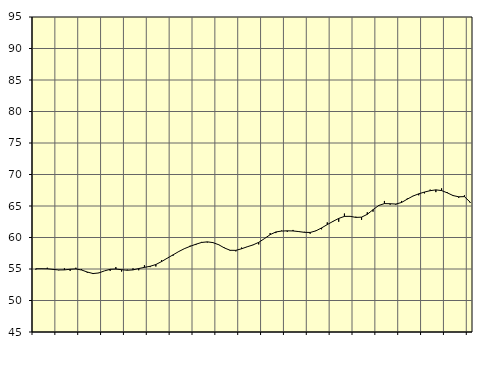
| Category | Piggar | Samtliga sysselsatta (inkl. sysselsatta utomlands) |
|---|---|---|
| nan | 54.9 | 55.04 |
| 1.0 | 55 | 55.04 |
| 1.0 | 55.2 | 55.03 |
| 1.0 | 54.9 | 54.94 |
| nan | 54.8 | 54.85 |
| 2.0 | 55.1 | 54.86 |
| 2.0 | 54.7 | 54.96 |
| 2.0 | 55.2 | 55.01 |
| nan | 55 | 54.84 |
| 3.0 | 54.4 | 54.52 |
| 3.0 | 54.2 | 54.28 |
| 3.0 | 54.4 | 54.37 |
| nan | 54.7 | 54.7 |
| 4.0 | 54.7 | 54.95 |
| 4.0 | 55.3 | 54.99 |
| 4.0 | 54.6 | 54.89 |
| nan | 54.9 | 54.8 |
| 5.0 | 55.1 | 54.86 |
| 5.0 | 54.8 | 55.07 |
| 5.0 | 55.6 | 55.26 |
| nan | 55.3 | 55.43 |
| 6.0 | 55.4 | 55.71 |
| 6.0 | 56.4 | 56.18 |
| 6.0 | 56.7 | 56.72 |
| nan | 57.1 | 57.24 |
| 7.0 | 57.8 | 57.77 |
| 7.0 | 58.2 | 58.23 |
| 7.0 | 58.7 | 58.6 |
| nan | 58.8 | 58.93 |
| 8.0 | 59.3 | 59.21 |
| 8.0 | 59.2 | 59.31 |
| 8.0 | 59.2 | 59.19 |
| nan | 58.9 | 58.85 |
| 9.0 | 58.4 | 58.34 |
| 9.0 | 57.9 | 57.97 |
| 9.0 | 57.8 | 57.96 |
| nan | 58.4 | 58.21 |
| 10.0 | 58.5 | 58.53 |
| 10.0 | 58.8 | 58.82 |
| 10.0 | 58.9 | 59.23 |
| nan | 59.8 | 59.82 |
| 11.0 | 60.7 | 60.45 |
| 11.0 | 60.7 | 60.88 |
| 11.0 | 61.1 | 61.02 |
| nan | 60.9 | 61.06 |
| 12.0 | 61.2 | 61.04 |
| 12.0 | 61 | 60.94 |
| 12.0 | 60.9 | 60.82 |
| nan | 60.6 | 60.8 |
| 13.0 | 61.1 | 61.05 |
| 13.0 | 61.3 | 61.52 |
| 13.0 | 62.4 | 62.05 |
| nan | 62.6 | 62.56 |
| 14.0 | 62.5 | 63.03 |
| 14.0 | 63.8 | 63.35 |
| 14.0 | 63.4 | 63.36 |
| nan | 63.3 | 63.19 |
| 15.0 | 62.8 | 63.23 |
| 15.0 | 64 | 63.68 |
| 15.0 | 64.1 | 64.41 |
| nan | 65 | 65.08 |
| 16.0 | 65.8 | 65.38 |
| 16.0 | 65.2 | 65.36 |
| 16.0 | 65.2 | 65.31 |
| nan | 65.8 | 65.56 |
| 17.0 | 66.2 | 66.09 |
| 17.0 | 66.6 | 66.58 |
| 17.0 | 66.7 | 66.93 |
| nan | 67 | 67.21 |
| 18.0 | 67.6 | 67.43 |
| 18.0 | 67.2 | 67.56 |
| 18.0 | 67.8 | 67.45 |
| nan | 67.2 | 67.09 |
| 19.0 | 66.6 | 66.66 |
| 19.0 | 66.3 | 66.46 |
| 19.0 | 66.7 | 66.49 |
| nan | 65.5 | 65.61 |